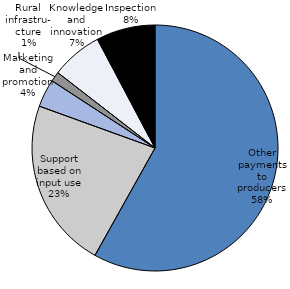
| Category | Series 0 |
|---|---|
| Other payments to producers | 213.48 |
| Support based on input use | 82.31 |
| Marketing and promotion | 13.5 |
| Rural infrastru-
cture | 4.77 |
| Knowledge and innovation | 24.81 |
| Inspection | 28.47 |